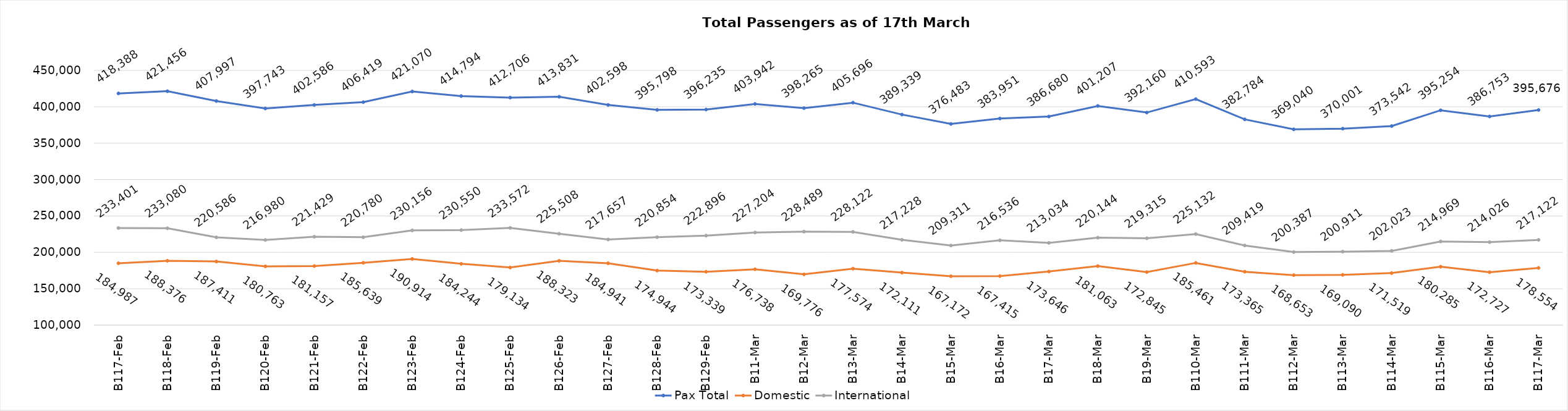
| Category | Pax Total | Domestic | International |
|---|---|---|---|
| 2024-02-17 | 418388 | 184987 | 233401 |
| 2024-02-18 | 421456 | 188376 | 233080 |
| 2024-02-19 | 407997 | 187411 | 220586 |
| 2024-02-20 | 397743 | 180763 | 216980 |
| 2024-02-21 | 402586 | 181157 | 221429 |
| 2024-02-22 | 406419 | 185639 | 220780 |
| 2024-02-23 | 421070 | 190914 | 230156 |
| 2024-02-24 | 414794 | 184244 | 230550 |
| 2024-02-25 | 412706 | 179134 | 233572 |
| 2024-02-26 | 413831 | 188323 | 225508 |
| 2024-02-27 | 402598 | 184941 | 217657 |
| 2024-02-28 | 395798 | 174944 | 220854 |
| 2024-02-29 | 396235 | 173339 | 222896 |
| 2024-03-01 | 403942 | 176738 | 227204 |
| 2024-03-02 | 398265 | 169776 | 228489 |
| 2024-03-03 | 405696 | 177574 | 228122 |
| 2024-03-04 | 389339 | 172111 | 217228 |
| 2024-03-05 | 376483 | 167172 | 209311 |
| 2024-03-06 | 383951 | 167415 | 216536 |
| 2024-03-07 | 386680 | 173646 | 213034 |
| 2024-03-08 | 401207 | 181063 | 220144 |
| 2024-03-09 | 392160 | 172845 | 219315 |
| 2024-03-10 | 410593 | 185461 | 225132 |
| 2024-03-11 | 382784 | 173365 | 209419 |
| 2024-03-12 | 369040 | 168653 | 200387 |
| 2024-03-13 | 370001 | 169090 | 200911 |
| 2024-03-14 | 373542 | 171519 | 202023 |
| 2024-03-15 | 395254 | 180285 | 214969 |
| 2024-03-16 | 386753 | 172727 | 214026 |
| 2024-03-17 | 395676 | 178554 | 217122 |